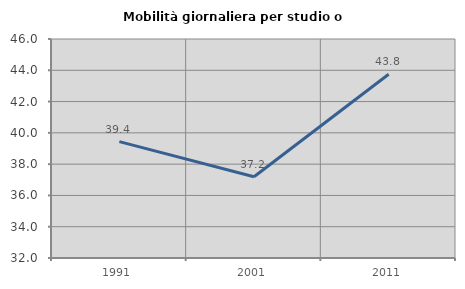
| Category | Mobilità giornaliera per studio o lavoro |
|---|---|
| 1991.0 | 39.437 |
| 2001.0 | 37.19 |
| 2011.0 | 43.75 |